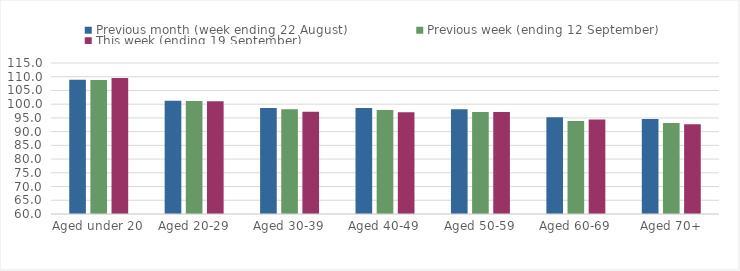
| Category | Previous month (week ending 22 August) | Previous week (ending 12 September) | This week (ending 19 September) |
|---|---|---|---|
| Aged under 20 | 108.92 | 108.83 | 109.54 |
| Aged 20-29 | 101.28 | 101.15 | 101.09 |
| Aged 30-39 | 98.57 | 98.15 | 97.22 |
| Aged 40-49 | 98.6 | 97.91 | 97.1 |
| Aged 50-59 | 98.12 | 97.18 | 97.17 |
| Aged 60-69 | 95.2 | 93.86 | 94.38 |
| Aged 70+ | 94.62 | 93.16 | 92.73 |